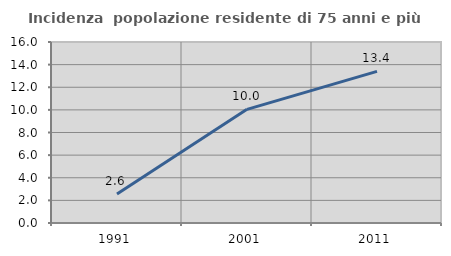
| Category | Incidenza  popolazione residente di 75 anni e più |
|---|---|
| 1991.0 | 2.557 |
| 2001.0 | 10.049 |
| 2011.0 | 13.408 |